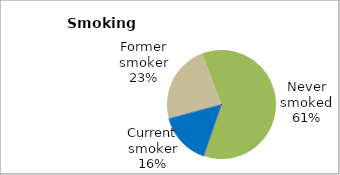
| Category | Series 0 |
|---|---|
| Current smoker | 15.52 |
| Former smoker | 23.458 |
| Never smoked | 61.021 |